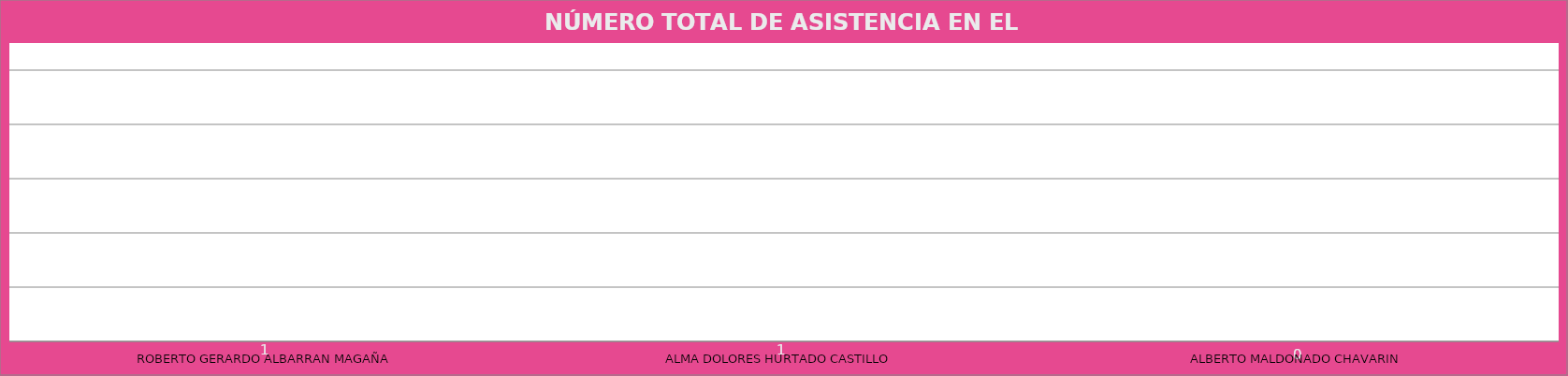
| Category | ROBERTO GERARDO ALBARRAN MAGAÑA |
|---|---|
| ROBERTO GERARDO ALBARRAN MAGAÑA | 1 |
| ALMA DOLORES HURTADO CASTILLO  | 1 |
| ALBERTO MALDONADO CHAVARIN  | 0 |